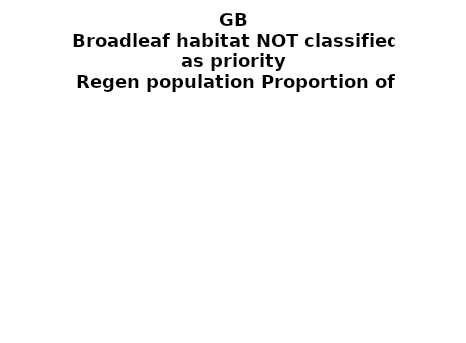
| Category | Broadleaf habitat NOT classified as priority |
|---|---|
| None | 0.092 |
| Seedlings only | 0 |
| Seedlings, saplings only | 0.033 |
| Seedlings, saplings, <7 cm trees | 0.169 |
| Saplings only | 0.198 |
| <7 cm trees, seedlings only | 0 |
| <7 cm trees, saplings only | 0.423 |
| <7 cm Trees only | 0.085 |